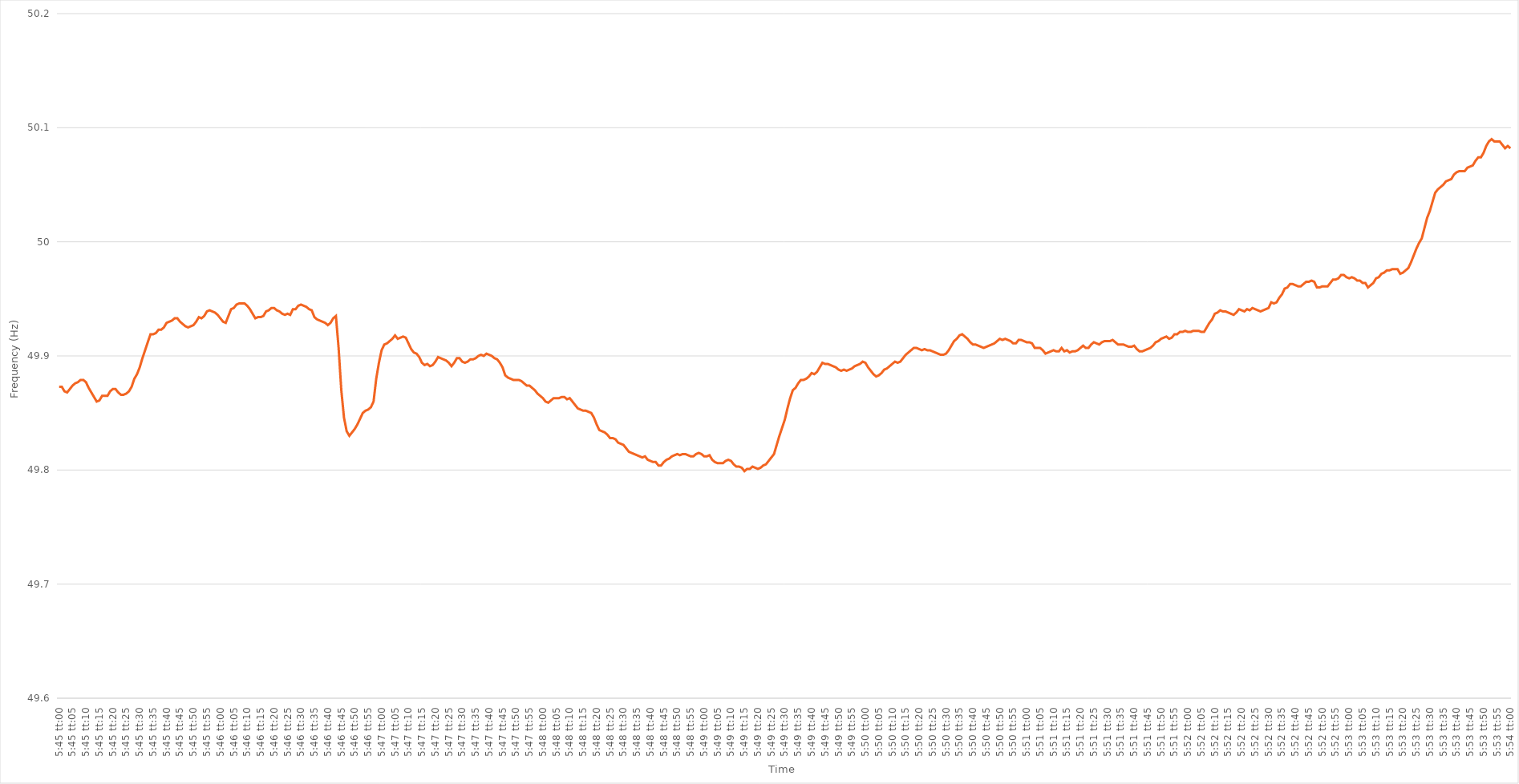
| Category | Series 0 |
|---|---|
| 0.23958333333333334 | 49.873 |
| 0.2395949074074074 | 49.873 |
| 0.23960648148148148 | 49.869 |
| 0.23961805555555557 | 49.868 |
| 0.23962962962962964 | 49.871 |
| 0.2396412037037037 | 49.874 |
| 0.2396527777777778 | 49.876 |
| 0.23966435185185186 | 49.877 |
| 0.23967592592592593 | 49.879 |
| 0.23968749999999997 | 49.879 |
| 0.2396990740740741 | 49.877 |
| 0.23971064814814813 | 49.872 |
| 0.23972222222222225 | 49.868 |
| 0.2397337962962963 | 49.864 |
| 0.23974537037037036 | 49.86 |
| 0.23975694444444443 | 49.861 |
| 0.23976851851851852 | 49.865 |
| 0.2397800925925926 | 49.865 |
| 0.23979166666666665 | 49.865 |
| 0.23980324074074075 | 49.869 |
| 0.23981481481481481 | 49.871 |
| 0.23982638888888888 | 49.871 |
| 0.23983796296296298 | 49.868 |
| 0.23984953703703704 | 49.866 |
| 0.2398611111111111 | 49.866 |
| 0.2398726851851852 | 49.867 |
| 0.23988425925925927 | 49.869 |
| 0.23989583333333334 | 49.873 |
| 0.23990740740740743 | 49.88 |
| 0.2399189814814815 | 49.884 |
| 0.23993055555555554 | 49.89 |
| 0.23994212962962966 | 49.898 |
| 0.2399537037037037 | 49.905 |
| 0.23996527777777776 | 49.912 |
| 0.23997685185185183 | 49.919 |
| 0.23998842592592592 | 49.919 |
| 0.24 | 49.92 |
| 0.24001157407407406 | 49.923 |
| 0.24002314814814815 | 49.923 |
| 0.24003472222222222 | 49.925 |
| 0.24004629629629629 | 49.929 |
| 0.24005787037037038 | 49.93 |
| 0.24006944444444445 | 49.931 |
| 0.2400810185185185 | 49.933 |
| 0.2400925925925926 | 49.933 |
| 0.24010416666666667 | 49.93 |
| 0.24011574074074074 | 49.928 |
| 0.24012731481481484 | 49.926 |
| 0.2401388888888889 | 49.925 |
| 0.24015046296296297 | 49.926 |
| 0.24016203703703706 | 49.927 |
| 0.2401736111111111 | 49.93 |
| 0.2401851851851852 | 49.934 |
| 0.24019675925925923 | 49.933 |
| 0.24020833333333333 | 49.935 |
| 0.2402199074074074 | 49.939 |
| 0.24023148148148146 | 49.94 |
| 0.24024305555555556 | 49.939 |
| 0.24025462962962962 | 49.938 |
| 0.2402662037037037 | 49.936 |
| 0.24027777777777778 | 49.933 |
| 0.24028935185185185 | 49.93 |
| 0.24030092592592592 | 49.929 |
| 0.2403125 | 49.935 |
| 0.24032407407407408 | 49.941 |
| 0.24033564814814815 | 49.942 |
| 0.24034722222222224 | 49.945 |
| 0.2403587962962963 | 49.946 |
| 0.24037037037037037 | 49.946 |
| 0.24038194444444447 | 49.946 |
| 0.2403935185185185 | 49.944 |
| 0.2404050925925926 | 49.941 |
| 0.24041666666666664 | 49.937 |
| 0.24042824074074076 | 49.933 |
| 0.2404398148148148 | 49.934 |
| 0.24045138888888887 | 49.934 |
| 0.24046296296296296 | 49.935 |
| 0.24047453703703703 | 49.939 |
| 0.2404861111111111 | 49.94 |
| 0.2404976851851852 | 49.942 |
| 0.24050925925925926 | 49.942 |
| 0.24052083333333332 | 49.94 |
| 0.24053240740740742 | 49.939 |
| 0.24054398148148148 | 49.937 |
| 0.24055555555555555 | 49.936 |
| 0.24056712962962964 | 49.937 |
| 0.2405787037037037 | 49.936 |
| 0.24059027777777778 | 49.941 |
| 0.24060185185185187 | 49.941 |
| 0.24061342592592594 | 49.944 |
| 0.240625 | 49.945 |
| 0.24063657407407404 | 49.944 |
| 0.24064814814814817 | 49.943 |
| 0.2406597222222222 | 49.941 |
| 0.24067129629629633 | 49.94 |
| 0.24068287037037037 | 49.934 |
| 0.24069444444444443 | 49.932 |
| 0.2407060185185185 | 49.931 |
| 0.2407175925925926 | 49.93 |
| 0.24072916666666666 | 49.929 |
| 0.24074074074074073 | 49.927 |
| 0.24075231481481482 | 49.929 |
| 0.2407638888888889 | 49.933 |
| 0.24077546296296296 | 49.935 |
| 0.24078703703703705 | 49.907 |
| 0.24079861111111112 | 49.87 |
| 0.24081018518518518 | 49.846 |
| 0.24082175925925928 | 49.834 |
| 0.24083333333333334 | 49.83 |
| 0.2408449074074074 | 49.833 |
| 0.2408564814814815 | 49.836 |
| 0.24086805555555557 | 49.84 |
| 0.2408796296296296 | 49.845 |
| 0.24089120370370373 | 49.85 |
| 0.24090277777777777 | 49.852 |
| 0.24091435185185184 | 49.853 |
| 0.2409259259259259 | 49.855 |
| 0.2409375 | 49.86 |
| 0.24094907407407407 | 49.88 |
| 0.24096064814814813 | 49.894 |
| 0.24097222222222223 | 49.905 |
| 0.2409837962962963 | 49.91 |
| 0.24099537037037036 | 49.911 |
| 0.24100694444444445 | 49.913 |
| 0.24101851851851852 | 49.915 |
| 0.2410300925925926 | 49.918 |
| 0.24104166666666668 | 49.915 |
| 0.24105324074074075 | 49.916 |
| 0.24106481481481482 | 49.917 |
| 0.2410763888888889 | 49.916 |
| 0.24108796296296298 | 49.911 |
| 0.24109953703703701 | 49.906 |
| 0.24111111111111114 | 49.903 |
| 0.24112268518518518 | 49.902 |
| 0.24113425925925927 | 49.899 |
| 0.2411458333333333 | 49.894 |
| 0.2411574074074074 | 49.892 |
| 0.24116898148148147 | 49.893 |
| 0.24118055555555554 | 49.891 |
| 0.24119212962962963 | 49.892 |
| 0.2412037037037037 | 49.895 |
| 0.24121527777777776 | 49.899 |
| 0.24122685185185186 | 49.898 |
| 0.24123842592592593 | 49.897 |
| 0.24125 | 49.896 |
| 0.2412615740740741 | 49.894 |
| 0.24127314814814815 | 49.891 |
| 0.24128472222222222 | 49.894 |
| 0.24129629629629631 | 49.898 |
| 0.24130787037037038 | 49.898 |
| 0.24131944444444445 | 49.895 |
| 0.24133101851851854 | 49.894 |
| 0.24134259259259258 | 49.895 |
| 0.24135416666666668 | 49.897 |
| 0.24136574074074071 | 49.897 |
| 0.24137731481481484 | 49.898 |
| 0.24138888888888888 | 49.9 |
| 0.24140046296296294 | 49.901 |
| 0.24141203703703704 | 49.9 |
| 0.2414236111111111 | 49.902 |
| 0.24143518518518517 | 49.901 |
| 0.24144675925925926 | 49.9 |
| 0.24145833333333333 | 49.898 |
| 0.2414699074074074 | 49.897 |
| 0.2414814814814815 | 49.894 |
| 0.24149305555555556 | 49.89 |
| 0.24150462962962962 | 49.883 |
| 0.24151620370370372 | 49.881 |
| 0.24152777777777779 | 49.88 |
| 0.24153935185185185 | 49.879 |
| 0.24155092592592595 | 49.879 |
| 0.2415625 | 49.879 |
| 0.24157407407407408 | 49.878 |
| 0.24158564814814812 | 49.876 |
| 0.24159722222222224 | 49.874 |
| 0.24160879629629628 | 49.874 |
| 0.24162037037037035 | 49.872 |
| 0.24163194444444444 | 49.87 |
| 0.2416435185185185 | 49.867 |
| 0.24165509259259257 | 49.865 |
| 0.24166666666666667 | 49.863 |
| 0.24167824074074074 | 49.86 |
| 0.2416898148148148 | 49.859 |
| 0.2417013888888889 | 49.861 |
| 0.24171296296296296 | 49.863 |
| 0.24172453703703703 | 49.863 |
| 0.24173611111111112 | 49.863 |
| 0.2417476851851852 | 49.864 |
| 0.24175925925925926 | 49.864 |
| 0.24177083333333335 | 49.862 |
| 0.24178240740740742 | 49.863 |
| 0.24179398148148148 | 49.86 |
| 0.24180555555555558 | 49.857 |
| 0.24181712962962965 | 49.854 |
| 0.24182870370370368 | 49.853 |
| 0.2418402777777778 | 49.852 |
| 0.24185185185185185 | 49.852 |
| 0.2418634259259259 | 49.851 |
| 0.24187499999999998 | 49.85 |
| 0.24188657407407407 | 49.846 |
| 0.24189814814814814 | 49.84 |
| 0.2419097222222222 | 49.835 |
| 0.2419212962962963 | 49.834 |
| 0.24193287037037037 | 49.833 |
| 0.24194444444444443 | 49.831 |
| 0.24195601851851853 | 49.828 |
| 0.2419675925925926 | 49.828 |
| 0.24197916666666666 | 49.827 |
| 0.24199074074074076 | 49.824 |
| 0.24200231481481482 | 49.823 |
| 0.2420138888888889 | 49.822 |
| 0.24202546296296298 | 49.819 |
| 0.24203703703703705 | 49.816 |
| 0.2420486111111111 | 49.815 |
| 0.2420601851851852 | 49.814 |
| 0.24207175925925925 | 49.813 |
| 0.24208333333333334 | 49.812 |
| 0.24209490740740738 | 49.811 |
| 0.24210648148148148 | 49.812 |
| 0.24211805555555554 | 49.809 |
| 0.2421296296296296 | 49.808 |
| 0.2421412037037037 | 49.807 |
| 0.24215277777777777 | 49.807 |
| 0.24216435185185184 | 49.804 |
| 0.24217592592592593 | 49.804 |
| 0.2421875 | 49.807 |
| 0.24219907407407407 | 49.809 |
| 0.24221064814814816 | 49.81 |
| 0.24222222222222223 | 49.812 |
| 0.2422337962962963 | 49.813 |
| 0.2422453703703704 | 49.814 |
| 0.24225694444444446 | 49.813 |
| 0.24226851851851852 | 49.814 |
| 0.24228009259259262 | 49.814 |
| 0.24229166666666666 | 49.813 |
| 0.24230324074074075 | 49.812 |
| 0.2423148148148148 | 49.812 |
| 0.2423263888888889 | 49.814 |
| 0.24233796296296295 | 49.815 |
| 0.24234953703703702 | 49.814 |
| 0.2423611111111111 | 49.812 |
| 0.24237268518518518 | 49.812 |
| 0.24238425925925924 | 49.813 |
| 0.24239583333333334 | 49.809 |
| 0.2424074074074074 | 49.807 |
| 0.24241898148148147 | 49.806 |
| 0.24243055555555557 | 49.806 |
| 0.24244212962962963 | 49.806 |
| 0.2424537037037037 | 49.808 |
| 0.2424652777777778 | 49.809 |
| 0.24247685185185186 | 49.808 |
| 0.24248842592592593 | 49.805 |
| 0.24250000000000002 | 49.803 |
| 0.2425115740740741 | 49.803 |
| 0.24252314814814815 | 49.802 |
| 0.2425347222222222 | 49.799 |
| 0.24254629629629632 | 49.801 |
| 0.24255787037037035 | 49.801 |
| 0.24256944444444442 | 49.803 |
| 0.24258101851851852 | 49.802 |
| 0.24259259259259258 | 49.801 |
| 0.24260416666666665 | 49.802 |
| 0.24261574074074074 | 49.804 |
| 0.2426273148148148 | 49.805 |
| 0.24263888888888888 | 49.808 |
| 0.24265046296296297 | 49.811 |
| 0.24266203703703704 | 49.814 |
| 0.2426736111111111 | 49.822 |
| 0.2426851851851852 | 49.83 |
| 0.24269675925925926 | 49.837 |
| 0.24270833333333333 | 49.844 |
| 0.24271990740740743 | 49.854 |
| 0.2427314814814815 | 49.863 |
| 0.24274305555555556 | 49.87 |
| 0.24275462962962965 | 49.872 |
| 0.24276620370370372 | 49.876 |
| 0.24277777777777776 | 49.879 |
| 0.24278935185185188 | 49.879 |
| 0.24280092592592592 | 49.88 |
| 0.2428125 | 49.882 |
| 0.24282407407407405 | 49.885 |
| 0.24283564814814815 | 49.884 |
| 0.24284722222222221 | 49.886 |
| 0.24285879629629628 | 49.89 |
| 0.24287037037037038 | 49.894 |
| 0.24288194444444444 | 49.893 |
| 0.2428935185185185 | 49.893 |
| 0.2429050925925926 | 49.892 |
| 0.24291666666666667 | 49.891 |
| 0.24292824074074074 | 49.89 |
| 0.24293981481481483 | 49.888 |
| 0.2429513888888889 | 49.887 |
| 0.24296296296296296 | 49.888 |
| 0.24297453703703706 | 49.887 |
| 0.24298611111111112 | 49.888 |
| 0.24299768518518516 | 49.889 |
| 0.24300925925925929 | 49.891 |
| 0.24302083333333332 | 49.892 |
| 0.24303240740740742 | 49.893 |
| 0.24304398148148146 | 49.895 |
| 0.24305555555555555 | 49.894 |
| 0.24306712962962962 | 49.89 |
| 0.24307870370370369 | 49.887 |
| 0.24309027777777778 | 49.884 |
| 0.24310185185185185 | 49.882 |
| 0.2431134259259259 | 49.883 |
| 0.243125 | 49.885 |
| 0.24313657407407407 | 49.888 |
| 0.24314814814814814 | 49.889 |
| 0.24315972222222224 | 49.891 |
| 0.2431712962962963 | 49.893 |
| 0.24318287037037037 | 49.895 |
| 0.24319444444444446 | 49.894 |
| 0.24320601851851853 | 49.895 |
| 0.2432175925925926 | 49.898 |
| 0.2432291666666667 | 49.901 |
| 0.24324074074074073 | 49.903 |
| 0.24325231481481482 | 49.905 |
| 0.24326388888888886 | 49.907 |
| 0.24327546296296299 | 49.907 |
| 0.24328703703703702 | 49.906 |
| 0.2432986111111111 | 49.905 |
| 0.24331018518518518 | 49.906 |
| 0.24332175925925925 | 49.905 |
| 0.24333333333333332 | 49.905 |
| 0.2433449074074074 | 49.904 |
| 0.24335648148148148 | 49.903 |
| 0.24336805555555555 | 49.902 |
| 0.24337962962962964 | 49.901 |
| 0.2433912037037037 | 49.901 |
| 0.24340277777777777 | 49.902 |
| 0.24341435185185187 | 49.905 |
| 0.24342592592592593 | 49.909 |
| 0.2434375 | 49.913 |
| 0.2434490740740741 | 49.915 |
| 0.24346064814814816 | 49.918 |
| 0.24347222222222223 | 49.919 |
| 0.24348379629629627 | 49.917 |
| 0.2434953703703704 | 49.915 |
| 0.24350694444444443 | 49.912 |
| 0.2435185185185185 | 49.91 |
| 0.2435300925925926 | 49.91 |
| 0.24354166666666666 | 49.909 |
| 0.24355324074074072 | 49.908 |
| 0.24356481481481482 | 49.907 |
| 0.24357638888888888 | 49.908 |
| 0.24358796296296295 | 49.909 |
| 0.24359953703703704 | 49.91 |
| 0.2436111111111111 | 49.911 |
| 0.24362268518518518 | 49.913 |
| 0.24363425925925927 | 49.915 |
| 0.24364583333333334 | 49.914 |
| 0.2436574074074074 | 49.915 |
| 0.2436689814814815 | 49.914 |
| 0.24368055555555557 | 49.913 |
| 0.24369212962962963 | 49.911 |
| 0.24370370370370367 | 49.911 |
| 0.2437152777777778 | 49.914 |
| 0.24372685185185183 | 49.914 |
| 0.24373842592592596 | 49.913 |
| 0.24375 | 49.912 |
| 0.24376157407407406 | 49.912 |
| 0.24377314814814813 | 49.911 |
| 0.24378472222222222 | 49.907 |
| 0.2437962962962963 | 49.907 |
| 0.24380787037037036 | 49.907 |
| 0.24381944444444445 | 49.905 |
| 0.24383101851851852 | 49.902 |
| 0.24384259259259258 | 49.903 |
| 0.24385416666666668 | 49.904 |
| 0.24386574074074074 | 49.905 |
| 0.2438773148148148 | 49.904 |
| 0.2438888888888889 | 49.904 |
| 0.24390046296296297 | 49.907 |
| 0.24391203703703704 | 49.904 |
| 0.24392361111111113 | 49.905 |
| 0.2439351851851852 | 49.903 |
| 0.24394675925925924 | 49.904 |
| 0.24395833333333336 | 49.904 |
| 0.2439699074074074 | 49.905 |
| 0.2439814814814815 | 49.907 |
| 0.24399305555555553 | 49.909 |
| 0.24400462962962963 | 49.907 |
| 0.2440162037037037 | 49.907 |
| 0.24402777777777776 | 49.91 |
| 0.24403935185185185 | 49.912 |
| 0.24405092592592592 | 49.911 |
| 0.2440625 | 49.91 |
| 0.24407407407407408 | 49.912 |
| 0.24408564814814815 | 49.913 |
| 0.24409722222222222 | 49.913 |
| 0.2441087962962963 | 49.913 |
| 0.24412037037037038 | 49.914 |
| 0.24413194444444444 | 49.912 |
| 0.24414351851851854 | 49.91 |
| 0.2441550925925926 | 49.91 |
| 0.24416666666666667 | 49.91 |
| 0.24417824074074077 | 49.909 |
| 0.2441898148148148 | 49.908 |
| 0.2442013888888889 | 49.908 |
| 0.24421296296296294 | 49.909 |
| 0.24422453703703703 | 49.906 |
| 0.2442361111111111 | 49.904 |
| 0.24424768518518516 | 49.904 |
| 0.24425925925925926 | 49.905 |
| 0.24427083333333333 | 49.906 |
| 0.2442824074074074 | 49.907 |
| 0.2442939814814815 | 49.909 |
| 0.24430555555555555 | 49.912 |
| 0.24431712962962962 | 49.913 |
| 0.24432870370370371 | 49.915 |
| 0.24434027777777778 | 49.916 |
| 0.24435185185185185 | 49.917 |
| 0.24436342592592594 | 49.915 |
| 0.244375 | 49.916 |
| 0.24438657407407408 | 49.919 |
| 0.24439814814814817 | 49.919 |
| 0.24440972222222224 | 49.921 |
| 0.2444212962962963 | 49.921 |
| 0.24443287037037034 | 49.922 |
| 0.24444444444444446 | 49.921 |
| 0.2444560185185185 | 49.921 |
| 0.24446759259259257 | 49.922 |
| 0.24447916666666666 | 49.922 |
| 0.24449074074074073 | 49.922 |
| 0.2445023148148148 | 49.921 |
| 0.2445138888888889 | 49.921 |
| 0.24452546296296296 | 49.925 |
| 0.24453703703703702 | 49.929 |
| 0.24454861111111112 | 49.932 |
| 0.24456018518518519 | 49.937 |
| 0.24457175925925925 | 49.938 |
| 0.24458333333333335 | 49.94 |
| 0.2445949074074074 | 49.939 |
| 0.24460648148148148 | 49.939 |
| 0.24461805555555557 | 49.938 |
| 0.24462962962962964 | 49.937 |
| 0.2446412037037037 | 49.936 |
| 0.24465277777777775 | 49.938 |
| 0.24466435185185187 | 49.941 |
| 0.2446759259259259 | 49.94 |
| 0.24468750000000003 | 49.939 |
| 0.24469907407407407 | 49.941 |
| 0.24471064814814814 | 49.94 |
| 0.2447222222222222 | 49.942 |
| 0.2447337962962963 | 49.941 |
| 0.24474537037037036 | 49.94 |
| 0.24475694444444443 | 49.939 |
| 0.24476851851851852 | 49.94 |
| 0.2447800925925926 | 49.941 |
| 0.24479166666666666 | 49.942 |
| 0.24480324074074075 | 49.947 |
| 0.24481481481481482 | 49.946 |
| 0.24482638888888889 | 49.947 |
| 0.24483796296296298 | 49.951 |
| 0.24484953703703705 | 49.954 |
| 0.2448611111111111 | 49.959 |
| 0.2448726851851852 | 49.96 |
| 0.24488425925925927 | 49.963 |
| 0.2448958333333333 | 49.963 |
| 0.24490740740740743 | 49.962 |
| 0.24491898148148147 | 49.961 |
| 0.24493055555555557 | 49.961 |
| 0.2449421296296296 | 49.963 |
| 0.2449537037037037 | 49.965 |
| 0.24496527777777777 | 49.965 |
| 0.24497685185185183 | 49.966 |
| 0.24498842592592593 | 49.965 |
| 0.245 | 49.96 |
| 0.24501157407407406 | 49.96 |
| 0.24502314814814816 | 49.961 |
| 0.24503472222222222 | 49.961 |
| 0.2450462962962963 | 49.961 |
| 0.24505787037037038 | 49.964 |
| 0.24506944444444445 | 49.967 |
| 0.24508101851851852 | 49.967 |
| 0.2450925925925926 | 49.968 |
| 0.24510416666666668 | 49.971 |
| 0.24511574074074075 | 49.971 |
| 0.24512731481481484 | 49.969 |
| 0.24513888888888888 | 49.968 |
| 0.24515046296296297 | 49.969 |
| 0.245162037037037 | 49.968 |
| 0.2451736111111111 | 49.966 |
| 0.24518518518518517 | 49.966 |
| 0.24519675925925924 | 49.964 |
| 0.24520833333333333 | 49.964 |
| 0.2452199074074074 | 49.96 |
| 0.24523148148148147 | 49.962 |
| 0.24524305555555556 | 49.964 |
| 0.24525462962962963 | 49.968 |
| 0.2452662037037037 | 49.969 |
| 0.2452777777777778 | 49.972 |
| 0.24528935185185186 | 49.973 |
| 0.24530092592592592 | 49.975 |
| 0.24531250000000002 | 49.975 |
| 0.24532407407407408 | 49.976 |
| 0.24533564814814815 | 49.976 |
| 0.24534722222222224 | 49.976 |
| 0.2453587962962963 | 49.972 |
| 0.24537037037037038 | 49.973 |
| 0.24538194444444442 | 49.975 |
| 0.24539351851851854 | 49.977 |
| 0.24540509259259258 | 49.982 |
| 0.24541666666666664 | 49.988 |
| 0.24542824074074074 | 49.994 |
| 0.2454398148148148 | 49.999 |
| 0.24545138888888887 | 50.003 |
| 0.24546296296296297 | 50.012 |
| 0.24547453703703703 | 50.021 |
| 0.2454861111111111 | 50.027 |
| 0.2454976851851852 | 50.035 |
| 0.24550925925925926 | 50.043 |
| 0.24552083333333333 | 50.046 |
| 0.24553240740740742 | 50.048 |
| 0.2455439814814815 | 50.05 |
| 0.24555555555555555 | 50.053 |
| 0.24556712962962965 | 50.054 |
| 0.24557870370370372 | 50.055 |
| 0.24559027777777778 | 50.059 |
| 0.24560185185185182 | 50.061 |
| 0.24561342592592594 | 50.062 |
| 0.24562499999999998 | 50.062 |
| 0.2456365740740741 | 50.062 |
| 0.24564814814814814 | 50.065 |
| 0.2456597222222222 | 50.066 |
| 0.24567129629629628 | 50.067 |
| 0.24568287037037037 | 50.071 |
| 0.24569444444444444 | 50.074 |
| 0.2457060185185185 | 50.074 |
| 0.2457175925925926 | 50.078 |
| 0.24572916666666667 | 50.084 |
| 0.24574074074074073 | 50.088 |
| 0.24575231481481483 | 50.09 |
| 0.2457638888888889 | 50.088 |
| 0.24577546296296296 | 50.088 |
| 0.24578703703703705 | 50.088 |
| 0.24579861111111112 | 50.085 |
| 0.2458101851851852 | 50.082 |
| 0.24582175925925928 | 50.084 |
| 0.24583333333333335 | 50.082 |